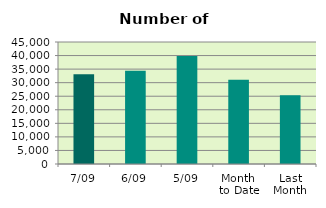
| Category | Series 0 |
|---|---|
| 7/09 | 33098 |
| 6/09 | 34390 |
| 5/09 | 39798 |
| Month 
to Date | 31064.8 |
| Last
Month | 25327.391 |